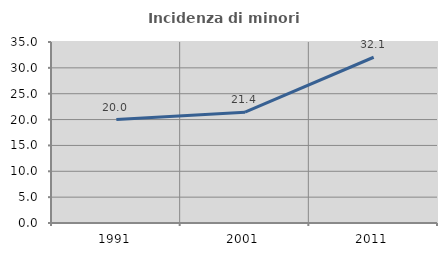
| Category | Incidenza di minori stranieri |
|---|---|
| 1991.0 | 20 |
| 2001.0 | 21.429 |
| 2011.0 | 32.051 |